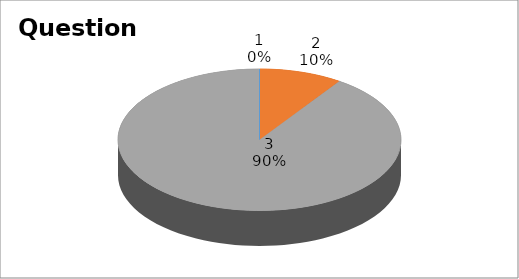
| Category | Series 0 |
|---|---|
| 0 | 0 |
| 1 | 2 |
| 2 | 19 |